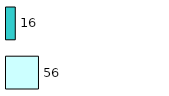
| Category | Series 0 | Series 1 |
|---|---|---|
| 0 | 56 | 16 |